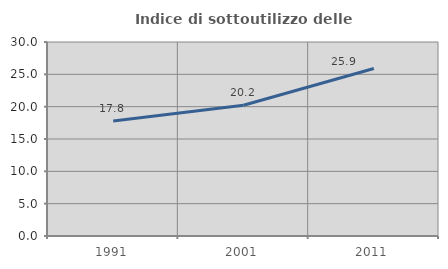
| Category | Indice di sottoutilizzo delle abitazioni  |
|---|---|
| 1991.0 | 17.792 |
| 2001.0 | 20.224 |
| 2011.0 | 25.909 |